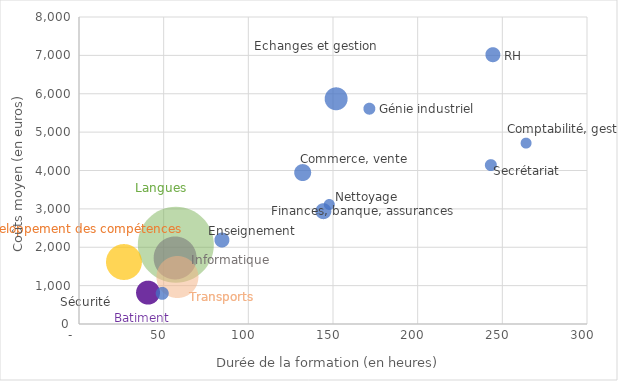
| Category | Domaines |
|---|---|
| 57.187647178 | 2066.761 |
| 56.71345376 | 1722.91 |
| 58.051910067 | 1227.78 |
| 26.53304827 | 1616.284 |
| 40.761927319 | 818.317 |
| 151.6423089 | 5877.903 |
| 132.00908329 | 3950.122 |
| 144.17744556 | 2946.979 |
| 244.29858079 | 7022.421 |
| 84.174587965 | 2198.466 |
| 48.888829787 | 810.404 |
| 243.1485426 | 4143.341 |
| 171.31928783 | 5617.738 |
| 263.92547009 | 4717.833 |
| 147.57301705 | 3124.617 |